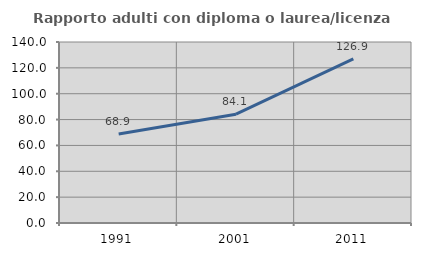
| Category | Rapporto adulti con diploma o laurea/licenza media  |
|---|---|
| 1991.0 | 68.852 |
| 2001.0 | 84.146 |
| 2011.0 | 126.923 |